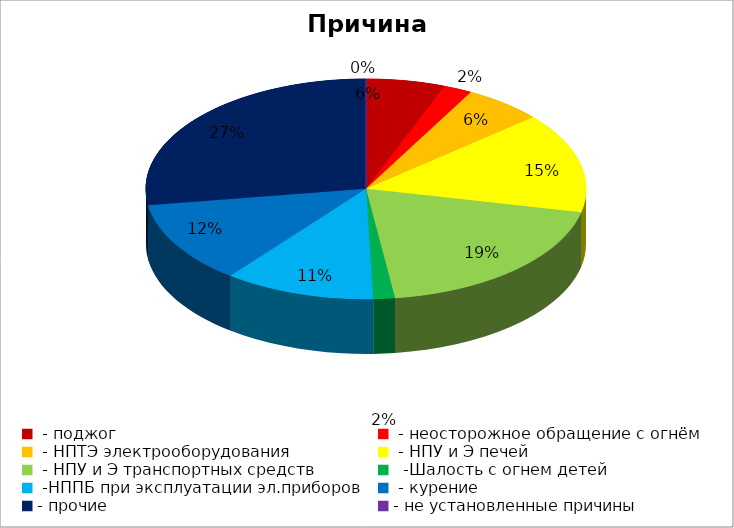
| Category | Причина пожара |
|---|---|
|  - поджог | 11 |
|  - неосторожное обращение с огнём | 4 |
|  - НПТЭ электрооборудования | 11 |
|  - НПУ и Э печей | 28 |
|  - НПУ и Э транспортных средств | 37 |
|   -Шалость с огнем детей | 3 |
|  -НППБ при эксплуатации эл.приборов | 21 |
|  - курение | 23 |
| - прочие | 52 |
| - не установленные причины | 0 |